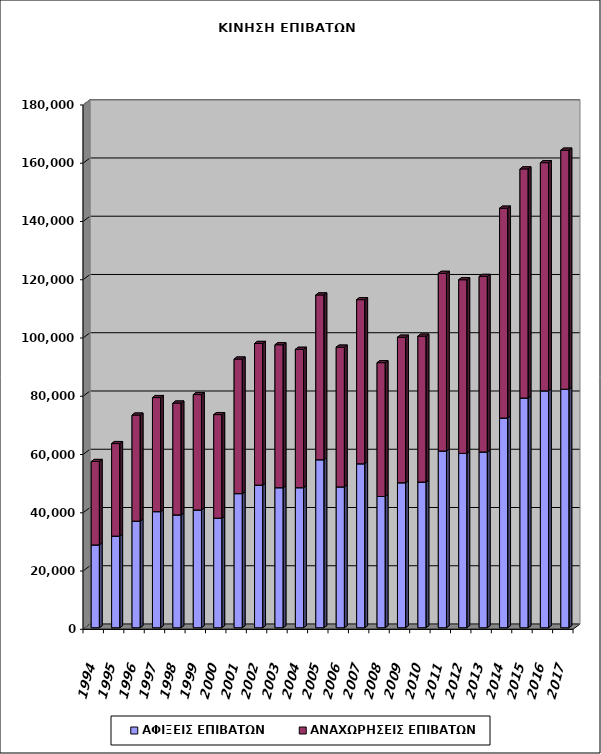
| Category | ΑΦΙΞΕΙΣ ΕΠΙΒΑΤΩΝ | ΑΝΑΧΩΡΗΣΕΙΣ ΕΠΙΒΑΤΩΝ |
|---|---|---|
| 1994.0 | 28424 | 28637 |
| 1995.0 | 31457 | 31761 |
| 1996.0 | 36598 | 36389 |
| 1997.0 | 39851 | 39159 |
| 1998.0 | 38729 | 38391 |
| 1999.0 | 40411 | 39629 |
| 2000.0 | 37605 | 35557 |
| 2001.0 | 46034 | 46197 |
| 2002.0 | 48961 | 48622 |
| 2003.0 | 48071 | 49075 |
| 2004.0 | 48073 | 47501 |
| 2005.0 | 57671 | 56564 |
| 2006.0 | 48348 | 47972 |
| 2007.0 | 56281 | 56339 |
| 2008.0 | 45050 | 45944 |
| 2009.0 | 49765 | 49963 |
| 2010.0 | 50005 | 50096 |
| 2011.0 | 60668 | 60984 |
| 2012.0 | 59845 | 59612 |
| 2013.0 | 60337 | 60258 |
| 2014.0 | 71986 | 72036 |
| 2015.0 | 78866 | 78651 |
| 2016.0 | 81322 | 78328 |
| 2017.0 | 81883 | 82054 |